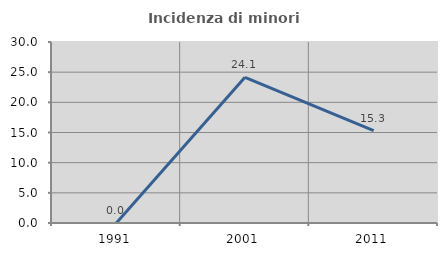
| Category | Incidenza di minori stranieri |
|---|---|
| 1991.0 | 0 |
| 2001.0 | 24.138 |
| 2011.0 | 15.315 |